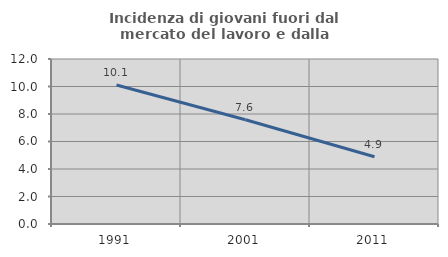
| Category | Incidenza di giovani fuori dal mercato del lavoro e dalla formazione  |
|---|---|
| 1991.0 | 10.106 |
| 2001.0 | 7.584 |
| 2011.0 | 4.89 |